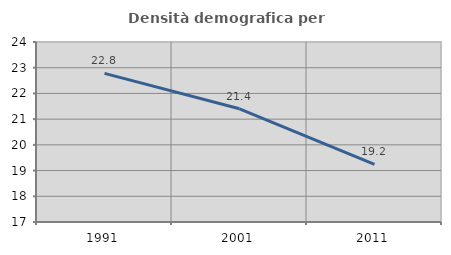
| Category | Densità demografica |
|---|---|
| 1991.0 | 22.78 |
| 2001.0 | 21.402 |
| 2011.0 | 19.243 |